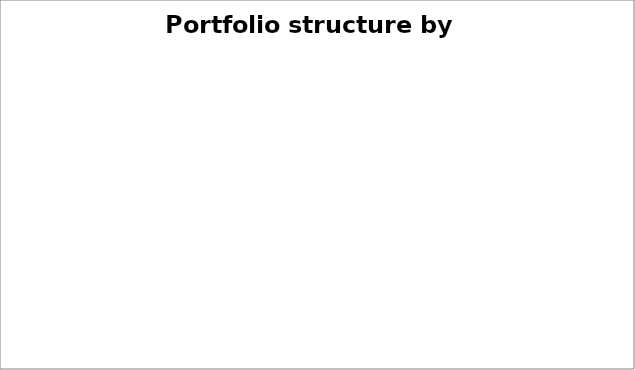
| Category | Series 0 |
|---|---|
| EUR | 0 |
| USD | 0 |
| GBP | 0 |